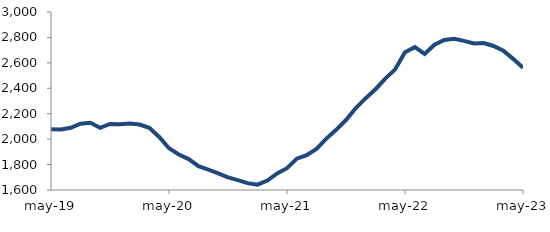
| Category | Series 0 |
|---|---|
| 2019-05-01 | 2078.07 |
| 2019-06-01 | 2076.377 |
| 2019-07-01 | 2089.152 |
| 2019-08-01 | 2121.901 |
| 2019-09-01 | 2128.491 |
| 2019-10-01 | 2088.553 |
| 2019-11-01 | 2119.211 |
| 2019-12-01 | 2116.27 |
| 2020-01-01 | 2123.179 |
| 2020-02-01 | 2115.217 |
| 2020-03-01 | 2088.6 |
| 2020-04-01 | 2017.241 |
| 2020-05-01 | 1928.116 |
| 2020-06-01 | 1878.979 |
| 2020-07-01 | 1843.29 |
| 2020-08-01 | 1787.543 |
| 2020-09-01 | 1760.281 |
| 2020-10-01 | 1731.197 |
| 2020-11-01 | 1698.835 |
| 2020-12-01 | 1677.184 |
| 2021-01-01 | 1654.072 |
| 2021-02-01 | 1641.869 |
| 2021-03-01 | 1673.821 |
| 2021-04-01 | 1730.759 |
| 2021-05-01 | 1771.425 |
| 2021-06-01 | 1846.573 |
| 2021-07-01 | 1874.111 |
| 2021-08-01 | 1922.894 |
| 2021-09-01 | 2004.225 |
| 2021-10-01 | 2073.331 |
| 2021-11-01 | 2150.314 |
| 2021-12-01 | 2244.492 |
| 2022-01-01 | 2321.95 |
| 2022-02-01 | 2392.65 |
| 2022-03-01 | 2476.383 |
| 2022-04-01 | 2549.069 |
| 2022-05-01 | 2683.336 |
| 2022-06-01 | 2723.868 |
| 2022-07-01 | 2670.585 |
| 2022-08-01 | 2742.913 |
| 2022-09-01 | 2780.46 |
| 2022-10-01 | 2788.916 |
| 2022-11-01 | 2772.628 |
| 2022-12-01 | 2752.307 |
| 2023-01-01 | 2755.69 |
| 2023-02-01 | 2732.653 |
| 2023-03-01 | 2696.107 |
| 2023-04-01 | 2631.454 |
| 2023-05-01 | 2561.826 |